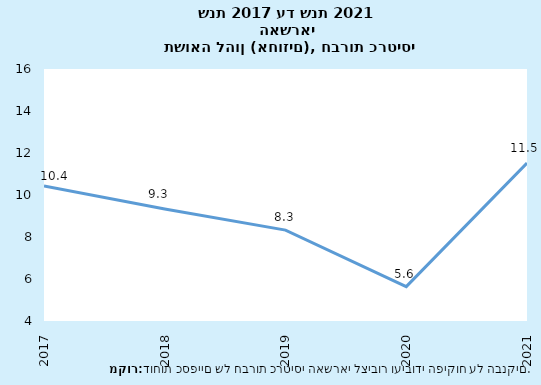
| Category | Series 0 |
|---|---|
| 2017-12-31 | 10.433 |
| 2018-12-31 | 9.337 |
| 2019-12-31 | 8.33 |
| 2020-12-31 | 5.637 |
| 2021-12-31 | 11.52 |